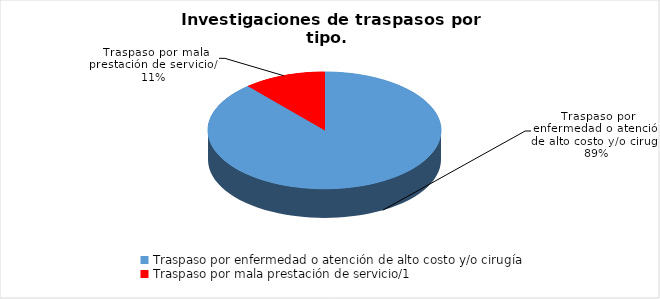
| Category | Series 0 |
|---|---|
| Traspaso por enfermedad o atención de alto costo y/o cirugía | 171 |
| Traspaso por mala prestación de servicio/1 | 22 |